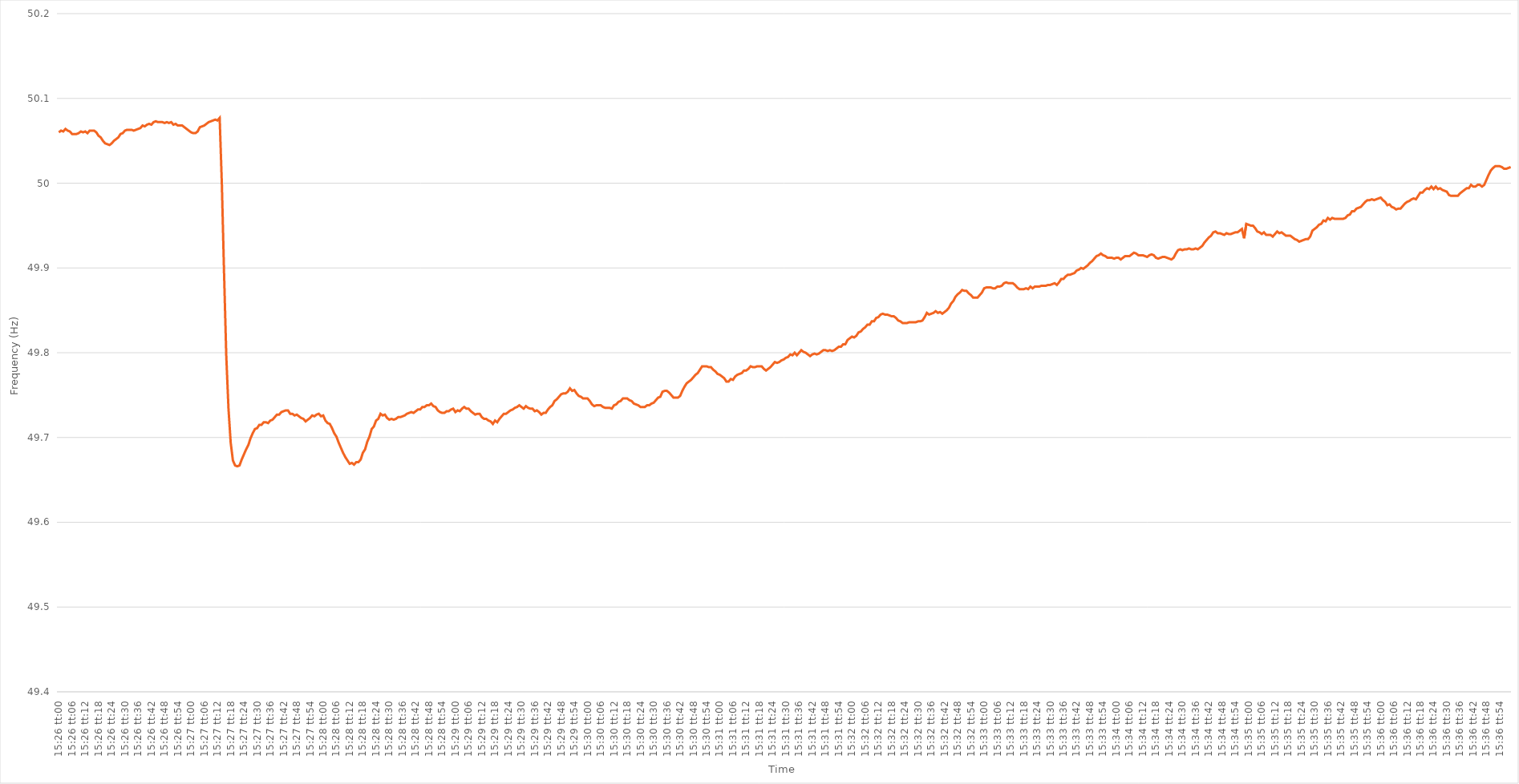
| Category | Series 0 |
|---|---|
| 0.6430555555555556 | 50.06 |
| 0.6430671296296296 | 50.062 |
| 0.6430787037037037 | 50.061 |
| 0.6430902777777777 | 50.064 |
| 0.6431018518518519 | 50.062 |
| 0.6431134259259259 | 50.061 |
| 0.6431250000000001 | 50.058 |
| 0.6431365740740741 | 50.058 |
| 0.6431481481481481 | 50.058 |
| 0.6431597222222222 | 50.059 |
| 0.6431712962962963 | 50.061 |
| 0.6431828703703704 | 50.06 |
| 0.6431944444444445 | 50.061 |
| 0.6432060185185186 | 50.059 |
| 0.6432175925925926 | 50.062 |
| 0.6432291666666666 | 50.062 |
| 0.6432407407407407 | 50.062 |
| 0.6432523148148148 | 50.06 |
| 0.6432638888888889 | 50.056 |
| 0.643275462962963 | 50.054 |
| 0.643287037037037 | 50.05 |
| 0.6432986111111111 | 50.047 |
| 0.6433101851851851 | 50.046 |
| 0.6433217592592593 | 50.045 |
| 0.6433333333333333 | 50.047 |
| 0.6433449074074075 | 50.05 |
| 0.6433564814814815 | 50.052 |
| 0.6433680555555555 | 50.054 |
| 0.6433796296296296 | 50.058 |
| 0.6433912037037037 | 50.059 |
| 0.6434027777777778 | 50.062 |
| 0.6434143518518519 | 50.063 |
| 0.643425925925926 | 50.063 |
| 0.6434375 | 50.063 |
| 0.643449074074074 | 50.062 |
| 0.6434606481481482 | 50.063 |
| 0.6434722222222222 | 50.064 |
| 0.6434837962962963 | 50.065 |
| 0.6434953703703704 | 50.068 |
| 0.6435069444444445 | 50.067 |
| 0.6435185185185185 | 50.069 |
| 0.6435300925925925 | 50.07 |
| 0.6435416666666667 | 50.069 |
| 0.6435532407407407 | 50.072 |
| 0.6435648148148149 | 50.073 |
| 0.6435763888888889 | 50.072 |
| 0.643587962962963 | 50.072 |
| 0.643599537037037 | 50.072 |
| 0.6436111111111111 | 50.071 |
| 0.6436226851851852 | 50.072 |
| 0.6436342592592593 | 50.071 |
| 0.6436458333333334 | 50.072 |
| 0.6436574074074074 | 50.069 |
| 0.6436689814814814 | 50.07 |
| 0.6436805555555556 | 50.068 |
| 0.6436921296296296 | 50.068 |
| 0.6437037037037037 | 50.068 |
| 0.6437152777777778 | 50.066 |
| 0.6437268518518519 | 50.064 |
| 0.6437384259259259 | 50.062 |
| 0.6437499999999999 | 50.06 |
| 0.6437615740740741 | 50.059 |
| 0.6437731481481481 | 50.059 |
| 0.6437847222222223 | 50.061 |
| 0.6437962962962963 | 50.066 |
| 0.6438078703703703 | 50.067 |
| 0.6438194444444444 | 50.068 |
| 0.6438310185185185 | 50.07 |
| 0.6438425925925926 | 50.072 |
| 0.6438541666666667 | 50.073 |
| 0.6438657407407408 | 50.074 |
| 0.6438773148148148 | 50.075 |
| 0.6438888888888888 | 50.074 |
| 0.643900462962963 | 50.077 |
| 0.643912037037037 | 49.998 |
| 0.6439236111111112 | 49.893 |
| 0.6439351851851852 | 49.796 |
| 0.6439467592592593 | 49.734 |
| 0.6439583333333333 | 49.694 |
| 0.6439699074074073 | 49.673 |
| 0.6439814814814815 | 49.667 |
| 0.6439930555555555 | 49.666 |
| 0.6440046296296297 | 49.667 |
| 0.6440162037037037 | 49.674 |
| 0.6440277777777778 | 49.68 |
| 0.6440393518518518 | 49.686 |
| 0.6440509259259259 | 49.691 |
| 0.6440625 | 49.699 |
| 0.6440740740740741 | 49.705 |
| 0.6440856481481482 | 49.71 |
| 0.6440972222222222 | 49.711 |
| 0.6441087962962962 | 49.715 |
| 0.6441203703703704 | 49.715 |
| 0.6441319444444444 | 49.718 |
| 0.6441435185185186 | 49.718 |
| 0.6441550925925926 | 49.717 |
| 0.6441666666666667 | 49.72 |
| 0.6441782407407407 | 49.721 |
| 0.6441898148148147 | 49.724 |
| 0.6442013888888889 | 49.727 |
| 0.6442129629629629 | 49.727 |
| 0.6442245370370371 | 49.73 |
| 0.6442361111111111 | 49.731 |
| 0.6442476851851852 | 49.732 |
| 0.6442592592592592 | 49.732 |
| 0.6442708333333333 | 49.728 |
| 0.6442824074074074 | 49.728 |
| 0.6442939814814815 | 49.726 |
| 0.6443055555555556 | 49.727 |
| 0.6443171296296296 | 49.725 |
| 0.6443287037037037 | 49.723 |
| 0.6443402777777778 | 49.722 |
| 0.6443518518518518 | 49.719 |
| 0.644363425925926 | 49.721 |
| 0.644375 | 49.723 |
| 0.6443865740740741 | 49.726 |
| 0.6443981481481481 | 49.725 |
| 0.6444097222222221 | 49.727 |
| 0.6444212962962963 | 49.728 |
| 0.6444328703703703 | 49.725 |
| 0.6444444444444445 | 49.726 |
| 0.6444560185185185 | 49.72 |
| 0.6444675925925926 | 49.717 |
| 0.6444791666666666 | 49.716 |
| 0.6444907407407408 | 49.711 |
| 0.6445023148148148 | 49.705 |
| 0.6445138888888889 | 49.701 |
| 0.644525462962963 | 49.694 |
| 0.644537037037037 | 49.688 |
| 0.6445486111111111 | 49.682 |
| 0.6445601851851852 | 49.677 |
| 0.6445717592592592 | 49.673 |
| 0.6445833333333334 | 49.669 |
| 0.6445949074074074 | 49.67 |
| 0.6446064814814815 | 49.668 |
| 0.6446180555555555 | 49.671 |
| 0.6446296296296297 | 49.671 |
| 0.6446412037037037 | 49.674 |
| 0.6446527777777779 | 49.682 |
| 0.6446643518518519 | 49.686 |
| 0.6446759259259259 | 49.695 |
| 0.6446875 | 49.701 |
| 0.644699074074074 | 49.71 |
| 0.6447106481481482 | 49.713 |
| 0.6447222222222222 | 49.72 |
| 0.6447337962962963 | 49.722 |
| 0.6447453703703704 | 49.728 |
| 0.6447569444444444 | 49.726 |
| 0.6447685185185185 | 49.727 |
| 0.6447800925925926 | 49.723 |
| 0.6447916666666667 | 49.721 |
| 0.6448032407407408 | 49.722 |
| 0.6448148148148148 | 49.721 |
| 0.6448263888888889 | 49.722 |
| 0.6448379629629629 | 49.724 |
| 0.6448495370370371 | 49.724 |
| 0.6448611111111111 | 49.725 |
| 0.6448726851851853 | 49.726 |
| 0.6448842592592593 | 49.728 |
| 0.6448958333333333 | 49.729 |
| 0.6449074074074074 | 49.73 |
| 0.6449189814814814 | 49.729 |
| 0.6449305555555556 | 49.731 |
| 0.6449421296296296 | 49.733 |
| 0.6449537037037038 | 49.733 |
| 0.6449652777777778 | 49.736 |
| 0.6449768518518518 | 49.736 |
| 0.6449884259259259 | 49.738 |
| 0.645 | 49.738 |
| 0.6450115740740741 | 49.74 |
| 0.6450231481481482 | 49.737 |
| 0.6450347222222222 | 49.736 |
| 0.6450462962962963 | 49.732 |
| 0.6450578703703703 | 49.73 |
| 0.6450694444444445 | 49.729 |
| 0.6450810185185185 | 49.729 |
| 0.6450925925925927 | 49.731 |
| 0.6451041666666667 | 49.731 |
| 0.6451157407407407 | 49.733 |
| 0.6451273148148148 | 49.734 |
| 0.6451388888888888 | 49.73 |
| 0.645150462962963 | 49.732 |
| 0.645162037037037 | 49.731 |
| 0.6451736111111112 | 49.734 |
| 0.6451851851851852 | 49.736 |
| 0.6451967592592592 | 49.734 |
| 0.6452083333333333 | 49.734 |
| 0.6452199074074074 | 49.731 |
| 0.6452314814814815 | 49.729 |
| 0.6452430555555556 | 49.727 |
| 0.6452546296296297 | 49.728 |
| 0.6452662037037037 | 49.728 |
| 0.6452777777777777 | 49.724 |
| 0.6452893518518519 | 49.722 |
| 0.6453009259259259 | 49.722 |
| 0.6453125000000001 | 49.72 |
| 0.6453240740740741 | 49.719 |
| 0.6453356481481481 | 49.716 |
| 0.6453472222222222 | 49.72 |
| 0.6453587962962963 | 49.718 |
| 0.6453703703703704 | 49.722 |
| 0.6453819444444444 | 49.725 |
| 0.6453935185185186 | 49.728 |
| 0.6454050925925926 | 49.728 |
| 0.6454166666666666 | 49.73 |
| 0.6454282407407407 | 49.732 |
| 0.6454398148148148 | 49.733 |
| 0.6454513888888889 | 49.735 |
| 0.645462962962963 | 49.736 |
| 0.645474537037037 | 49.738 |
| 0.6454861111111111 | 49.736 |
| 0.6454976851851851 | 49.734 |
| 0.6455092592592593 | 49.737 |
| 0.6455208333333333 | 49.735 |
| 0.6455324074074075 | 49.734 |
| 0.6455439814814815 | 49.734 |
| 0.6455555555555555 | 49.731 |
| 0.6455671296296296 | 49.732 |
| 0.6455787037037037 | 49.73 |
| 0.6455902777777778 | 49.727 |
| 0.6456018518518518 | 49.729 |
| 0.645613425925926 | 49.729 |
| 0.645625 | 49.733 |
| 0.645636574074074 | 49.736 |
| 0.6456481481481481 | 49.738 |
| 0.6456597222222222 | 49.743 |
| 0.6456712962962963 | 49.745 |
| 0.6456828703703704 | 49.748 |
| 0.6456944444444445 | 49.751 |
| 0.6457060185185185 | 49.752 |
| 0.6457175925925925 | 49.752 |
| 0.6457291666666667 | 49.754 |
| 0.6457407407407407 | 49.758 |
| 0.6457523148148149 | 49.755 |
| 0.6457638888888889 | 49.756 |
| 0.645775462962963 | 49.752 |
| 0.645787037037037 | 49.749 |
| 0.6457986111111111 | 49.748 |
| 0.6458101851851852 | 49.746 |
| 0.6458217592592593 | 49.746 |
| 0.6458333333333334 | 49.746 |
| 0.6458449074074074 | 49.743 |
| 0.6458564814814814 | 49.739 |
| 0.6458680555555555 | 49.737 |
| 0.6458796296296296 | 49.738 |
| 0.6458912037037037 | 49.738 |
| 0.6459027777777778 | 49.738 |
| 0.6459143518518519 | 49.736 |
| 0.6459259259259259 | 49.735 |
| 0.6459374999999999 | 49.735 |
| 0.6459490740740741 | 49.735 |
| 0.6459606481481481 | 49.734 |
| 0.6459722222222223 | 49.738 |
| 0.6459837962962963 | 49.739 |
| 0.6459953703703704 | 49.742 |
| 0.6460069444444444 | 49.743 |
| 0.6460185185185185 | 49.746 |
| 0.6460300925925926 | 49.746 |
| 0.6460416666666667 | 49.746 |
| 0.6460532407407408 | 49.744 |
| 0.6460648148148148 | 49.743 |
| 0.6460763888888889 | 49.74 |
| 0.6460879629629629 | 49.739 |
| 0.646099537037037 | 49.738 |
| 0.6461111111111111 | 49.736 |
| 0.6461226851851852 | 49.736 |
| 0.6461342592592593 | 49.736 |
| 0.6461458333333333 | 49.738 |
| 0.6461574074074073 | 49.738 |
| 0.6461689814814815 | 49.74 |
| 0.6461805555555555 | 49.741 |
| 0.6461921296296297 | 49.744 |
| 0.6462037037037037 | 49.747 |
| 0.6462152777777778 | 49.748 |
| 0.6462268518518518 | 49.754 |
| 0.646238425925926 | 49.755 |
| 0.64625 | 49.755 |
| 0.6462615740740741 | 49.753 |
| 0.6462731481481482 | 49.75 |
| 0.6462847222222222 | 49.747 |
| 0.6462962962962963 | 49.747 |
| 0.6463078703703703 | 49.747 |
| 0.6463194444444444 | 49.749 |
| 0.6463310185185185 | 49.755 |
| 0.6463425925925926 | 49.76 |
| 0.6463541666666667 | 49.764 |
| 0.6463657407407407 | 49.766 |
| 0.6463773148148148 | 49.768 |
| 0.6463888888888889 | 49.771 |
| 0.6464004629629629 | 49.774 |
| 0.6464120370370371 | 49.776 |
| 0.6464236111111111 | 49.78 |
| 0.6464351851851852 | 49.784 |
| 0.6464467592592592 | 49.784 |
| 0.6464583333333334 | 49.784 |
| 0.6464699074074074 | 49.783 |
| 0.6464814814814815 | 49.783 |
| 0.6464930555555556 | 49.78 |
| 0.6465046296296296 | 49.778 |
| 0.6465162037037037 | 49.775 |
| 0.6465277777777778 | 49.774 |
| 0.6465393518518519 | 49.772 |
| 0.646550925925926 | 49.77 |
| 0.6465625 | 49.766 |
| 0.6465740740740741 | 49.766 |
| 0.6465856481481481 | 49.769 |
| 0.6465972222222222 | 49.768 |
| 0.6466087962962963 | 49.772 |
| 0.6466203703703703 | 49.774 |
| 0.6466319444444445 | 49.775 |
| 0.6466435185185185 | 49.776 |
| 0.6466550925925926 | 49.779 |
| 0.6466666666666666 | 49.779 |
| 0.6466782407407408 | 49.781 |
| 0.6466898148148148 | 49.784 |
| 0.646701388888889 | 49.783 |
| 0.646712962962963 | 49.783 |
| 0.646724537037037 | 49.784 |
| 0.6467361111111111 | 49.784 |
| 0.6467476851851852 | 49.784 |
| 0.6467592592592593 | 49.781 |
| 0.6467708333333334 | 49.779 |
| 0.6467824074074074 | 49.781 |
| 0.6467939814814815 | 49.783 |
| 0.6468055555555555 | 49.786 |
| 0.6468171296296296 | 49.789 |
| 0.6468287037037037 | 49.788 |
| 0.6468402777777778 | 49.789 |
| 0.6468518518518519 | 49.791 |
| 0.6468634259259259 | 49.792 |
| 0.646875 | 49.794 |
| 0.646886574074074 | 49.795 |
| 0.6468981481481482 | 49.798 |
| 0.6469097222222222 | 49.797 |
| 0.6469212962962964 | 49.8 |
| 0.6469328703703704 | 49.797 |
| 0.6469444444444444 | 49.8 |
| 0.6469560185185185 | 49.803 |
| 0.6469675925925926 | 49.801 |
| 0.6469791666666667 | 49.8 |
| 0.6469907407407408 | 49.798 |
| 0.6470023148148148 | 49.796 |
| 0.6470138888888889 | 49.798 |
| 0.6470254629629629 | 49.799 |
| 0.647037037037037 | 49.798 |
| 0.6470486111111111 | 49.799 |
| 0.6470601851851852 | 49.801 |
| 0.6470717592592593 | 49.803 |
| 0.6470833333333333 | 49.803 |
| 0.6470949074074074 | 49.802 |
| 0.6471064814814814 | 49.803 |
| 0.6471180555555556 | 49.802 |
| 0.6471296296296296 | 49.803 |
| 0.6471412037037038 | 49.805 |
| 0.6471527777777778 | 49.807 |
| 0.6471643518518518 | 49.807 |
| 0.6471759259259259 | 49.81 |
| 0.6471875 | 49.81 |
| 0.6471990740740741 | 49.815 |
| 0.6472106481481482 | 49.817 |
| 0.6472222222222223 | 49.819 |
| 0.6472337962962963 | 49.818 |
| 0.6472453703703703 | 49.82 |
| 0.6472569444444444 | 49.824 |
| 0.6472685185185185 | 49.825 |
| 0.6472800925925926 | 49.828 |
| 0.6472916666666667 | 49.83 |
| 0.6473032407407407 | 49.833 |
| 0.6473148148148148 | 49.833 |
| 0.6473263888888888 | 49.837 |
| 0.647337962962963 | 49.837 |
| 0.647349537037037 | 49.841 |
| 0.6473611111111112 | 49.842 |
| 0.6473726851851852 | 49.845 |
| 0.6473842592592592 | 49.846 |
| 0.6473958333333333 | 49.845 |
| 0.6474074074074074 | 49.845 |
| 0.6474189814814815 | 49.844 |
| 0.6474305555555556 | 49.843 |
| 0.6474421296296297 | 49.843 |
| 0.6474537037037037 | 49.841 |
| 0.6474652777777777 | 49.838 |
| 0.6474768518518519 | 49.837 |
| 0.6474884259259259 | 49.835 |
| 0.6475 | 49.835 |
| 0.6475115740740741 | 49.835 |
| 0.6475231481481482 | 49.836 |
| 0.6475347222222222 | 49.836 |
| 0.6475462962962962 | 49.836 |
| 0.6475578703703704 | 49.836 |
| 0.6475694444444444 | 49.837 |
| 0.6475810185185186 | 49.837 |
| 0.6475925925925926 | 49.838 |
| 0.6476041666666666 | 49.842 |
| 0.6476157407407407 | 49.847 |
| 0.6476273148148148 | 49.845 |
| 0.6476388888888889 | 49.846 |
| 0.647650462962963 | 49.847 |
| 0.6476620370370371 | 49.849 |
| 0.6476736111111111 | 49.847 |
| 0.6476851851851851 | 49.848 |
| 0.6476967592592593 | 49.846 |
| 0.6477083333333333 | 49.848 |
| 0.6477199074074075 | 49.85 |
| 0.6477314814814815 | 49.853 |
| 0.6477430555555556 | 49.858 |
| 0.6477546296296296 | 49.861 |
| 0.6477662037037036 | 49.866 |
| 0.6477777777777778 | 49.869 |
| 0.6477893518518518 | 49.871 |
| 0.647800925925926 | 49.874 |
| 0.6478125 | 49.873 |
| 0.647824074074074 | 49.873 |
| 0.6478356481481481 | 49.87 |
| 0.6478472222222222 | 49.868 |
| 0.6478587962962963 | 49.865 |
| 0.6478703703703704 | 49.865 |
| 0.6478819444444445 | 49.865 |
| 0.6478935185185185 | 49.868 |
| 0.6479050925925925 | 49.871 |
| 0.6479166666666667 | 49.876 |
| 0.6479282407407407 | 49.877 |
| 0.6479398148148149 | 49.877 |
| 0.6479513888888889 | 49.877 |
| 0.647962962962963 | 49.876 |
| 0.647974537037037 | 49.876 |
| 0.647986111111111 | 49.878 |
| 0.6479976851851852 | 49.878 |
| 0.6480092592592592 | 49.879 |
| 0.6480208333333334 | 49.882 |
| 0.6480324074074074 | 49.883 |
| 0.6480439814814815 | 49.882 |
| 0.6480555555555555 | 49.882 |
| 0.6480671296296296 | 49.882 |
| 0.6480787037037037 | 49.88 |
| 0.6480902777777778 | 49.877 |
| 0.6481018518518519 | 49.875 |
| 0.6481134259259259 | 49.875 |
| 0.648125 | 49.875 |
| 0.6481365740740741 | 49.876 |
| 0.6481481481481481 | 49.875 |
| 0.6481597222222223 | 49.878 |
| 0.6481712962962963 | 49.876 |
| 0.6481828703703704 | 49.878 |
| 0.6481944444444444 | 49.878 |
| 0.6482060185185184 | 49.878 |
| 0.6482175925925926 | 49.879 |
| 0.6482291666666666 | 49.879 |
| 0.6482407407407408 | 49.879 |
| 0.6482523148148148 | 49.88 |
| 0.6482638888888889 | 49.88 |
| 0.6482754629629629 | 49.881 |
| 0.648287037037037 | 49.882 |
| 0.6482986111111111 | 49.88 |
| 0.6483101851851852 | 49.883 |
| 0.6483217592592593 | 49.887 |
| 0.6483333333333333 | 49.887 |
| 0.6483449074074074 | 49.89 |
| 0.6483564814814815 | 49.892 |
| 0.6483680555555555 | 49.892 |
| 0.6483796296296297 | 49.893 |
| 0.6483912037037037 | 49.894 |
| 0.6484027777777778 | 49.897 |
| 0.6484143518518518 | 49.898 |
| 0.648425925925926 | 49.9 |
| 0.6484375 | 49.899 |
| 0.648449074074074 | 49.901 |
| 0.6484606481481482 | 49.903 |
| 0.6484722222222222 | 49.906 |
| 0.6484837962962963 | 49.908 |
| 0.6484953703703703 | 49.911 |
| 0.6485069444444445 | 49.914 |
| 0.6485185185185185 | 49.915 |
| 0.6485300925925926 | 49.917 |
| 0.6485416666666667 | 49.915 |
| 0.6485532407407407 | 49.914 |
| 0.6485648148148148 | 49.912 |
| 0.6485763888888889 | 49.912 |
| 0.648587962962963 | 49.912 |
| 0.6485995370370371 | 49.911 |
| 0.6486111111111111 | 49.912 |
| 0.6486226851851852 | 49.912 |
| 0.6486342592592592 | 49.91 |
| 0.6486458333333334 | 49.912 |
| 0.6486574074074074 | 49.914 |
| 0.6486689814814816 | 49.914 |
| 0.6486805555555556 | 49.914 |
| 0.6486921296296296 | 49.916 |
| 0.6487037037037037 | 49.918 |
| 0.6487152777777777 | 49.917 |
| 0.6487268518518519 | 49.915 |
| 0.6487384259259259 | 49.915 |
| 0.64875 | 49.915 |
| 0.6487615740740741 | 49.914 |
| 0.6487731481481481 | 49.913 |
| 0.6487847222222222 | 49.915 |
| 0.6487962962962963 | 49.916 |
| 0.6488078703703704 | 49.915 |
| 0.6488194444444445 | 49.912 |
| 0.6488310185185185 | 49.911 |
| 0.6488425925925926 | 49.912 |
| 0.6488541666666666 | 49.913 |
| 0.6488657407407408 | 49.913 |
| 0.6488773148148148 | 49.912 |
| 0.648888888888889 | 49.911 |
| 0.648900462962963 | 49.91 |
| 0.648912037037037 | 49.912 |
| 0.6489236111111111 | 49.917 |
| 0.6489351851851851 | 49.921 |
| 0.6489467592592593 | 49.922 |
| 0.6489583333333333 | 49.921 |
| 0.6489699074074075 | 49.922 |
| 0.6489814814814815 | 49.922 |
| 0.6489930555555555 | 49.923 |
| 0.6490046296296296 | 49.922 |
| 0.6490162037037037 | 49.922 |
| 0.6490277777777778 | 49.923 |
| 0.6490393518518519 | 49.922 |
| 0.649050925925926 | 49.924 |
| 0.6490625 | 49.926 |
| 0.649074074074074 | 49.93 |
| 0.6490856481481482 | 49.933 |
| 0.6490972222222222 | 49.936 |
| 0.6491087962962964 | 49.938 |
| 0.6491203703703704 | 49.942 |
| 0.6491319444444444 | 49.943 |
| 0.6491435185185185 | 49.941 |
| 0.6491550925925925 | 49.941 |
| 0.6491666666666667 | 49.94 |
| 0.6491782407407407 | 49.939 |
| 0.6491898148148149 | 49.941 |
| 0.6492013888888889 | 49.94 |
| 0.6492129629629629 | 49.94 |
| 0.649224537037037 | 49.941 |
| 0.6492361111111111 | 49.942 |
| 0.6492476851851852 | 49.942 |
| 0.6492592592592593 | 49.944 |
| 0.6492708333333334 | 49.946 |
| 0.6492824074074074 | 49.935 |
| 0.6492939814814814 | 49.952 |
| 0.6493055555555556 | 49.951 |
| 0.6493171296296296 | 49.95 |
| 0.6493287037037038 | 49.95 |
| 0.6493402777777778 | 49.947 |
| 0.6493518518518518 | 49.943 |
| 0.6493634259259259 | 49.942 |
| 0.649375 | 49.94 |
| 0.6493865740740741 | 49.942 |
| 0.6493981481481481 | 49.939 |
| 0.6494097222222223 | 49.939 |
| 0.6494212962962963 | 49.939 |
| 0.6494328703703703 | 49.937 |
| 0.6494444444444444 | 49.94 |
| 0.6494560185185185 | 49.943 |
| 0.6494675925925926 | 49.941 |
| 0.6494791666666667 | 49.942 |
| 0.6494907407407408 | 49.94 |
| 0.6495023148148148 | 49.938 |
| 0.6495138888888888 | 49.938 |
| 0.649525462962963 | 49.938 |
| 0.649537037037037 | 49.936 |
| 0.6495486111111112 | 49.934 |
| 0.6495601851851852 | 49.933 |
| 0.6495717592592593 | 49.931 |
| 0.6495833333333333 | 49.932 |
| 0.6495949074074074 | 49.933 |
| 0.6496064814814815 | 49.934 |
| 0.6496180555555556 | 49.934 |
| 0.6496296296296297 | 49.937 |
| 0.6496412037037037 | 49.944 |
| 0.6496527777777777 | 49.946 |
| 0.6496643518518518 | 49.948 |
| 0.6496759259259259 | 49.951 |
| 0.6496875 | 49.952 |
| 0.6496990740740741 | 49.956 |
| 0.6497106481481482 | 49.955 |
| 0.6497222222222222 | 49.959 |
| 0.6497337962962962 | 49.957 |
| 0.6497453703703704 | 49.959 |
| 0.6497569444444444 | 49.958 |
| 0.6497685185185186 | 49.958 |
| 0.6497800925925926 | 49.958 |
| 0.6497916666666667 | 49.958 |
| 0.6498032407407407 | 49.958 |
| 0.6498148148148148 | 49.959 |
| 0.6498263888888889 | 49.962 |
| 0.649837962962963 | 49.963 |
| 0.6498495370370371 | 49.967 |
| 0.6498611111111111 | 49.967 |
| 0.6498726851851852 | 49.97 |
| 0.6498842592592592 | 49.971 |
| 0.6498958333333333 | 49.972 |
| 0.6499074074074074 | 49.975 |
| 0.6499189814814815 | 49.978 |
| 0.6499305555555556 | 49.98 |
| 0.6499421296296296 | 49.98 |
| 0.6499537037037036 | 49.981 |
| 0.6499652777777778 | 49.98 |
| 0.6499768518518518 | 49.981 |
| 0.649988425925926 | 49.982 |
| 0.65 | 49.983 |
| 0.6500115740740741 | 49.98 |
| 0.6500231481481481 | 49.978 |
| 0.6500347222222222 | 49.974 |
| 0.6500462962962963 | 49.975 |
| 0.6500578703703704 | 49.972 |
| 0.6500694444444445 | 49.971 |
| 0.6500810185185185 | 49.969 |
| 0.6500925925925926 | 49.97 |
| 0.6501041666666666 | 49.97 |
| 0.6501157407407407 | 49.973 |
| 0.6501273148148148 | 49.976 |
| 0.6501388888888889 | 49.978 |
| 0.650150462962963 | 49.979 |
| 0.650162037037037 | 49.981 |
| 0.650173611111111 | 49.982 |
| 0.6501851851851852 | 49.981 |
| 0.6501967592592592 | 49.985 |
| 0.6502083333333334 | 49.989 |
| 0.6502199074074074 | 49.989 |
| 0.6502314814814815 | 49.992 |
| 0.6502430555555555 | 49.994 |
| 0.6502546296296297 | 49.993 |
| 0.6502662037037037 | 49.996 |
| 0.6502777777777778 | 49.993 |
| 0.6502893518518519 | 49.996 |
| 0.6503009259259259 | 49.993 |
| 0.6503125 | 49.994 |
| 0.6503240740740741 | 49.992 |
| 0.6503356481481481 | 49.991 |
| 0.6503472222222222 | 49.99 |
| 0.6503587962962963 | 49.986 |
| 0.6503703703703704 | 49.985 |
| 0.6503819444444444 | 49.985 |
| 0.6503935185185185 | 49.985 |
| 0.6504050925925926 | 49.985 |
| 0.6504166666666666 | 49.988 |
| 0.6504282407407408 | 49.99 |
| 0.6504398148148148 | 49.992 |
| 0.6504513888888889 | 49.994 |
| 0.6504629629629629 | 49.994 |
| 0.6504745370370371 | 49.998 |
| 0.6504861111111111 | 49.996 |
| 0.6504976851851852 | 49.996 |
| 0.6505092592592593 | 49.998 |
| 0.6505208333333333 | 49.998 |
| 0.6505324074074074 | 49.996 |
| 0.6505439814814815 | 49.998 |
| 0.6505555555555556 | 50.004 |
| 0.6505671296296297 | 50.01 |
| 0.6505787037037037 | 50.015 |
| 0.6505902777777778 | 50.018 |
| 0.6506018518518518 | 50.02 |
| 0.6506134259259259 | 50.02 |
| 0.650625 | 50.02 |
| 0.650636574074074 | 50.019 |
| 0.6506481481481482 | 50.017 |
| 0.6506597222222222 | 50.017 |
| 0.6506712962962963 | 50.018 |
| 0.6506828703703703 | 50.019 |